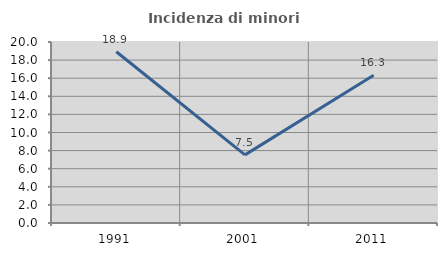
| Category | Incidenza di minori stranieri |
|---|---|
| 1991.0 | 18.919 |
| 2001.0 | 7.527 |
| 2011.0 | 16.318 |